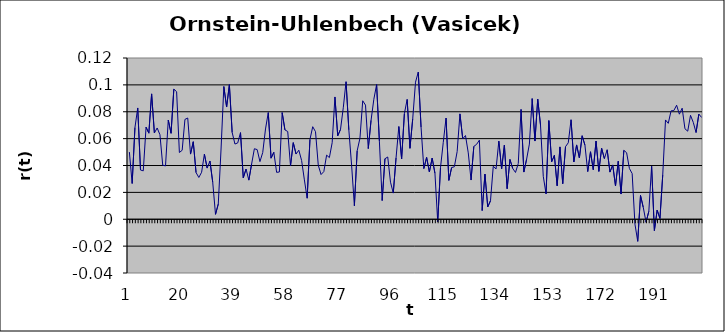
| Category | Series 0 |
|---|---|
| 0 | 0.05 |
| 1 | 0.027 |
| 2 | 0.068 |
| 3 | 0.083 |
| 4 | 0.037 |
| 5 | 0.036 |
| 6 | 0.069 |
| 7 | 0.064 |
| 8 | 0.093 |
| 9 | 0.064 |
| 10 | 0.068 |
| 11 | 0.063 |
| 12 | 0.04 |
| 13 | 0.04 |
| 14 | 0.074 |
| 15 | 0.064 |
| 16 | 0.097 |
| 17 | 0.095 |
| 18 | 0.05 |
| 19 | 0.051 |
| 20 | 0.074 |
| 21 | 0.075 |
| 22 | 0.048 |
| 23 | 0.058 |
| 24 | 0.035 |
| 25 | 0.031 |
| 26 | 0.035 |
| 27 | 0.048 |
| 28 | 0.038 |
| 29 | 0.043 |
| 30 | 0.027 |
| 31 | 0.004 |
| 32 | 0.011 |
| 33 | 0.052 |
| 34 | 0.099 |
| 35 | 0.084 |
| 36 | 0.1 |
| 37 | 0.065 |
| 38 | 0.056 |
| 39 | 0.057 |
| 40 | 0.064 |
| 41 | 0.031 |
| 42 | 0.037 |
| 43 | 0.029 |
| 44 | 0.041 |
| 45 | 0.052 |
| 46 | 0.052 |
| 47 | 0.043 |
| 48 | 0.05 |
| 49 | 0.067 |
| 50 | 0.079 |
| 51 | 0.045 |
| 52 | 0.05 |
| 53 | 0.035 |
| 54 | 0.035 |
| 55 | 0.079 |
| 56 | 0.066 |
| 57 | 0.065 |
| 58 | 0.04 |
| 59 | 0.057 |
| 60 | 0.049 |
| 61 | 0.051 |
| 62 | 0.044 |
| 63 | 0.029 |
| 64 | 0.016 |
| 65 | 0.059 |
| 66 | 0.069 |
| 67 | 0.065 |
| 68 | 0.04 |
| 69 | 0.033 |
| 70 | 0.035 |
| 71 | 0.048 |
| 72 | 0.046 |
| 73 | 0.057 |
| 74 | 0.091 |
| 75 | 0.062 |
| 76 | 0.067 |
| 77 | 0.083 |
| 78 | 0.102 |
| 79 | 0.067 |
| 80 | 0.04 |
| 81 | 0.01 |
| 82 | 0.051 |
| 83 | 0.06 |
| 84 | 0.088 |
| 85 | 0.085 |
| 86 | 0.053 |
| 87 | 0.074 |
| 88 | 0.089 |
| 89 | 0.1 |
| 90 | 0.058 |
| 91 | 0.014 |
| 92 | 0.045 |
| 93 | 0.046 |
| 94 | 0.028 |
| 95 | 0.019 |
| 96 | 0.046 |
| 97 | 0.069 |
| 98 | 0.045 |
| 99 | 0.079 |
| 100 | 0.089 |
| 101 | 0.053 |
| 102 | 0.075 |
| 103 | 0.102 |
| 104 | 0.11 |
| 105 | 0.069 |
| 106 | 0.038 |
| 107 | 0.046 |
| 108 | 0.035 |
| 109 | 0.046 |
| 110 | 0.034 |
| 111 | -0.002 |
| 112 | 0.038 |
| 113 | 0.057 |
| 114 | 0.075 |
| 115 | 0.029 |
| 116 | 0.038 |
| 117 | 0.039 |
| 118 | 0.05 |
| 119 | 0.078 |
| 120 | 0.06 |
| 121 | 0.062 |
| 122 | 0.049 |
| 123 | 0.029 |
| 124 | 0.054 |
| 125 | 0.056 |
| 126 | 0.059 |
| 127 | 0.006 |
| 128 | 0.034 |
| 129 | 0.009 |
| 130 | 0.014 |
| 131 | 0.039 |
| 132 | 0.037 |
| 133 | 0.058 |
| 134 | 0.038 |
| 135 | 0.055 |
| 136 | 0.023 |
| 137 | 0.044 |
| 138 | 0.038 |
| 139 | 0.035 |
| 140 | 0.041 |
| 141 | 0.082 |
| 142 | 0.035 |
| 143 | 0.045 |
| 144 | 0.056 |
| 145 | 0.09 |
| 146 | 0.058 |
| 147 | 0.089 |
| 148 | 0.07 |
| 149 | 0.032 |
| 150 | 0.019 |
| 151 | 0.073 |
| 152 | 0.043 |
| 153 | 0.048 |
| 154 | 0.025 |
| 155 | 0.054 |
| 156 | 0.026 |
| 157 | 0.054 |
| 158 | 0.057 |
| 159 | 0.074 |
| 160 | 0.043 |
| 161 | 0.055 |
| 162 | 0.046 |
| 163 | 0.062 |
| 164 | 0.055 |
| 165 | 0.035 |
| 166 | 0.05 |
| 167 | 0.037 |
| 168 | 0.058 |
| 169 | 0.036 |
| 170 | 0.053 |
| 171 | 0.045 |
| 172 | 0.052 |
| 173 | 0.035 |
| 174 | 0.04 |
| 175 | 0.025 |
| 176 | 0.043 |
| 177 | 0.019 |
| 178 | 0.051 |
| 179 | 0.05 |
| 180 | 0.038 |
| 181 | 0.034 |
| 182 | -0.004 |
| 183 | -0.016 |
| 184 | 0.018 |
| 185 | 0.009 |
| 186 | -0.002 |
| 187 | 0.006 |
| 188 | 0.04 |
| 189 | -0.008 |
| 190 | 0.007 |
| 191 | 0.001 |
| 192 | 0.033 |
| 193 | 0.074 |
| 194 | 0.071 |
| 195 | 0.081 |
| 196 | 0.081 |
| 197 | 0.085 |
| 198 | 0.078 |
| 199 | 0.083 |
| 200 | 0.067 |
| 201 | 0.066 |
| 202 | 0.077 |
| 203 | 0.072 |
| 204 | 0.065 |
| 205 | 0.078 |
| 206 | 0.076 |